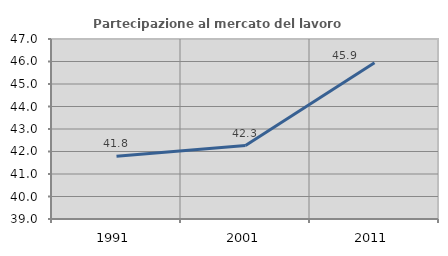
| Category | Partecipazione al mercato del lavoro  femminile |
|---|---|
| 1991.0 | 41.784 |
| 2001.0 | 42.266 |
| 2011.0 | 45.941 |